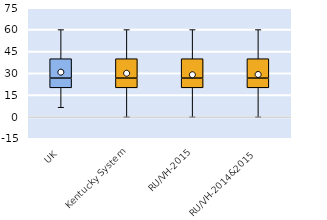
| Category | 25th | 50th | 75th |
|---|---|---|---|
| UK | 20 | 6.667 | 13.333 |
| Kentucky System | 20 | 6.667 | 13.333 |
| RU/VH-2015 | 20 | 6.667 | 13.333 |
| RU/VH-2014&2015 | 20 | 6.667 | 13.333 |